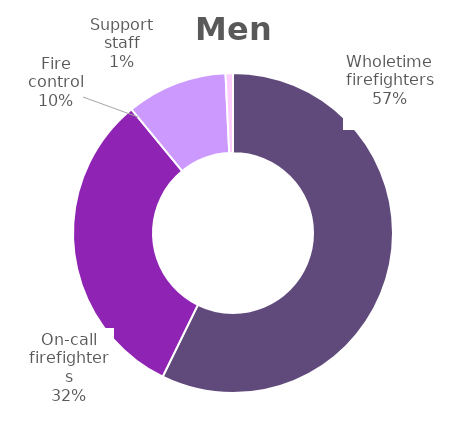
| Category | Men |
|---|---|
| Wholetime firefighters | 0.572 |
| On-call firefighters | 0.318 |
| Fire control | 0.102 |
| Support staff | 0.007 |